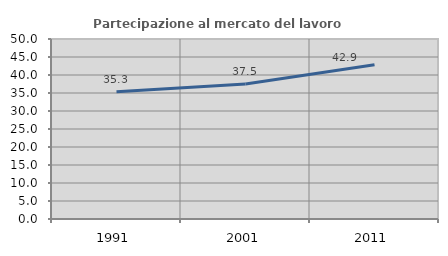
| Category | Partecipazione al mercato del lavoro  femminile |
|---|---|
| 1991.0 | 35.32 |
| 2001.0 | 37.5 |
| 2011.0 | 42.867 |